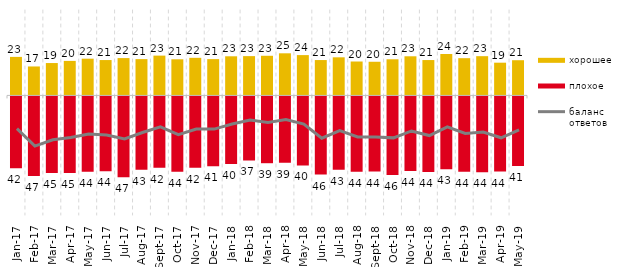
| Category | хорошее | плохое |
|---|---|---|
| 2017-01-01 | 22.55 | -42 |
| 2017-02-01 | 16.95 | -46.6 |
| 2017-03-01 | 18.95 | -44.9 |
| 2017-04-01 | 20.2 | -44.85 |
| 2017-05-01 | 21.5 | -44.1 |
| 2017-06-01 | 20.7 | -43.85 |
| 2017-07-01 | 21.85 | -47.35 |
| 2017-08-01 | 21.25 | -42.95 |
| 2017-09-01 | 23.3 | -41.7 |
| 2017-10-01 | 21.15 | -44.15 |
| 2017-11-01 | 22 | -41.7 |
| 2017-12-01 | 21.25 | -40.95 |
| 2018-01-01 | 22.9 | -39.6 |
| 2018-02-01 | 23 | -37.45 |
| 2018-03-01 | 23.2 | -39.1 |
| 2018-04-01 | 24.65 | -38.8 |
| 2018-05-01 | 23.6 | -40.4 |
| 2018-06-01 | 20.7 | -45.75 |
| 2018-07-01 | 22.3 | -42.95 |
| 2018-08-01 | 19.85 | -44.15 |
| 2018-09-01 | 19.7 | -44 |
| 2018-10-01 | 21.15 | -46 |
| 2018-11-01 | 22.904 | -43.713 |
| 2018-12-01 | 20.7 | -44.2 |
| 2019-01-01 | 24.25 | -42.65 |
| 2019-02-01 | 21.8 | -44.05 |
| 2019-03-01 | 22.974 | -44.455 |
| 2019-04-01 | 19.158 | -43.96 |
| 2019-05-01 | 20.604 | -40.763 |